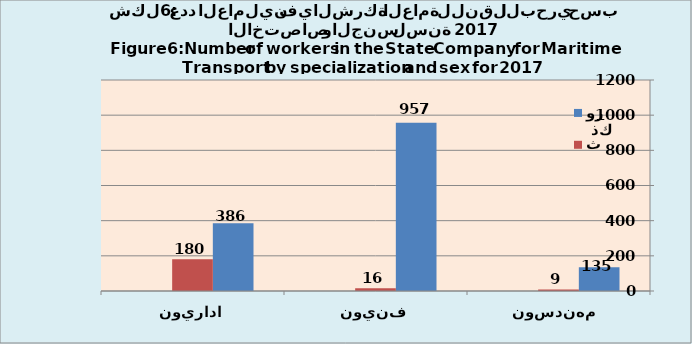
| Category | ذكور  | اناث |
|---|---|---|
| مهندسون  | 135 |  |
| فنيون | 957 |  |
| اداريون | 386 |  |